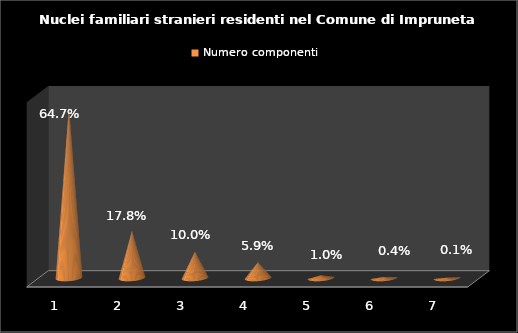
| Category | Numero componenti |
|---|---|
| 1.0 | 0.647 |
| 2.0 | 0.178 |
| 3.0 | 0.1 |
| 4.0 | 0.059 |
| 5.0 | 0.01 |
| 6.0 | 0.004 |
| 7.0 | 0.001 |